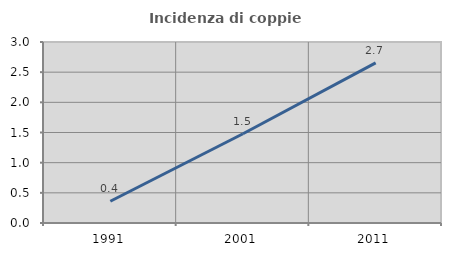
| Category | Incidenza di coppie miste |
|---|---|
| 1991.0 | 0.36 |
| 2001.0 | 1.48 |
| 2011.0 | 2.653 |